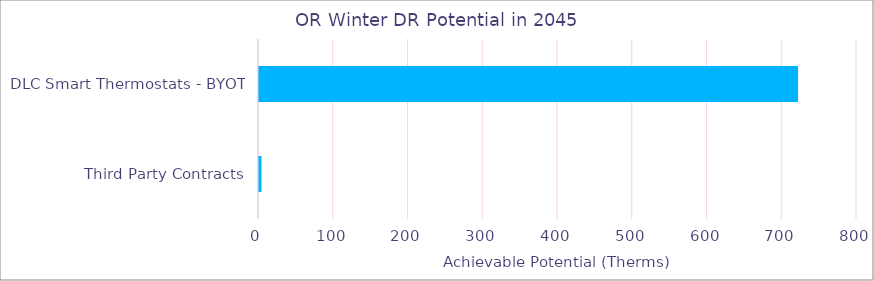
| Category | OR |
|---|---|
| DLC Smart Thermostats - BYOT | 722.503 |
| Third Party Contracts | 4.662 |